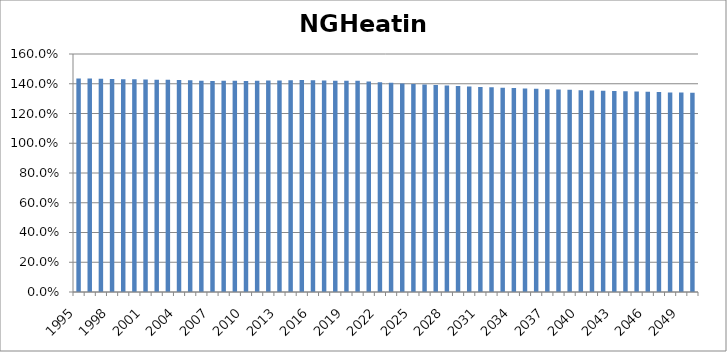
| Category | NGHeating |
|---|---|
| 1995.0 | 1.436 |
| 1996.0 | 1.435 |
| 1997.0 | 1.433 |
| 1998.0 | 1.432 |
| 1999.0 | 1.431 |
| 2000.0 | 1.43 |
| 2001.0 | 1.429 |
| 2002.0 | 1.427 |
| 2003.0 | 1.426 |
| 2004.0 | 1.425 |
| 2005.0 | 1.424 |
| 2006.0 | 1.42 |
| 2007.0 | 1.419 |
| 2008.0 | 1.42 |
| 2009.0 | 1.42 |
| 2010.0 | 1.419 |
| 2011.0 | 1.42 |
| 2012.0 | 1.421 |
| 2013.0 | 1.422 |
| 2014.0 | 1.424 |
| 2015.0 | 1.425 |
| 2016.0 | 1.424 |
| 2017.0 | 1.422 |
| 2018.0 | 1.421 |
| 2019.0 | 1.42 |
| 2020.0 | 1.42 |
| 2021.0 | 1.415 |
| 2022.0 | 1.41 |
| 2023.0 | 1.406 |
| 2024.0 | 1.402 |
| 2025.0 | 1.398 |
| 2026.0 | 1.394 |
| 2027.0 | 1.391 |
| 2028.0 | 1.388 |
| 2029.0 | 1.384 |
| 2030.0 | 1.381 |
| 2031.0 | 1.378 |
| 2032.0 | 1.376 |
| 2033.0 | 1.373 |
| 2034.0 | 1.371 |
| 2035.0 | 1.368 |
| 2036.0 | 1.366 |
| 2037.0 | 1.364 |
| 2038.0 | 1.361 |
| 2039.0 | 1.359 |
| 2040.0 | 1.357 |
| 2041.0 | 1.355 |
| 2042.0 | 1.353 |
| 2043.0 | 1.351 |
| 2044.0 | 1.349 |
| 2045.0 | 1.347 |
| 2046.0 | 1.346 |
| 2047.0 | 1.344 |
| 2048.0 | 1.342 |
| 2049.0 | 1.34 |
| 2050.0 | 1.339 |